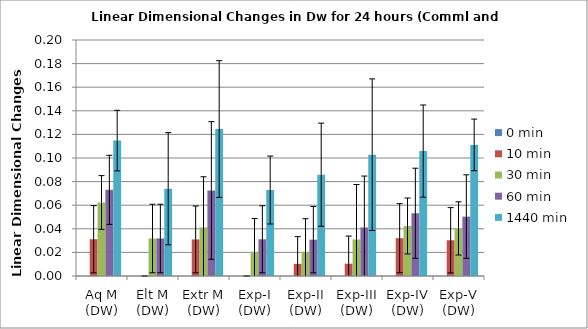
| Category | 0 min | 10 min | 30 min | 60 min | 1440 min |
|---|---|---|---|---|---|
| Aq M (DW) | 0 | 0.031 | 0.062 | 0.073 | 0.115 |
| Elt M (DW) | 0 | 0 | 0.032 | 0.032 | 0.074 |
| Extr M (DW) | 0 | 0.031 | 0.041 | 0.072 | 0.125 |
| Exp-I (DW) | 0 | 0 | 0.021 | 0.031 | 0.073 |
| Exp-II (DW) | 0 | 0.01 | 0.02 | 0.031 | 0.086 |
| Exp-III (DW) | 0 | 0.01 | 0.031 | 0.041 | 0.103 |
| Exp-IV (DW) | 0 | 0.032 | 0.042 | 0.053 | 0.106 |
| Exp-V (DW) | 0 | 0.03 | 0.04 | 0.05 | 0.111 |